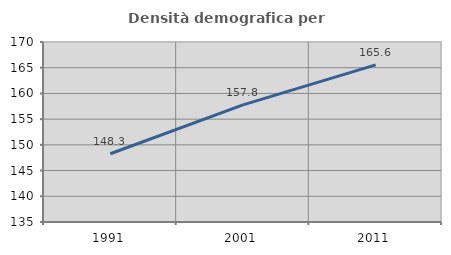
| Category | Densità demografica |
|---|---|
| 1991.0 | 148.266 |
| 2001.0 | 157.785 |
| 2011.0 | 165.561 |